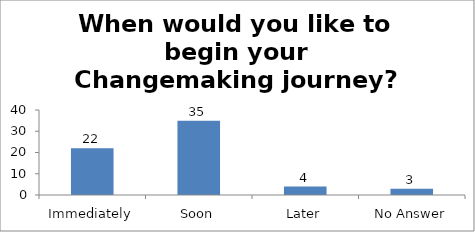
| Category | When would you like to begin your Changemaking journey?  |
|---|---|
| Immediately | 22 |
| Soon | 35 |
| Later | 4 |
| No Answer | 3 |